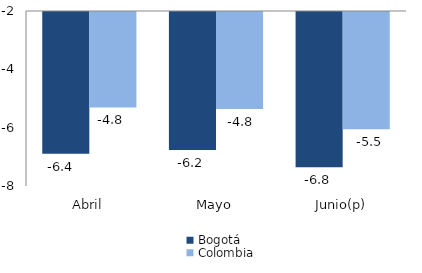
| Category | Bogotá | Colombia |
|---|---|---|
| Abril | -6.362 | -4.771 |
| Mayo | -6.232 | -4.829 |
| Junio(p) | -6.821 | -5.524 |